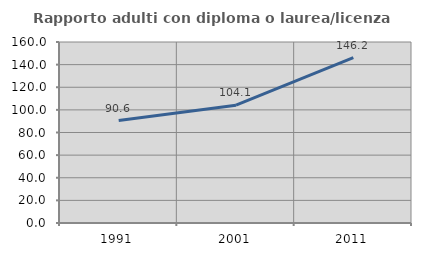
| Category | Rapporto adulti con diploma o laurea/licenza media  |
|---|---|
| 1991.0 | 90.588 |
| 2001.0 | 104.143 |
| 2011.0 | 146.154 |